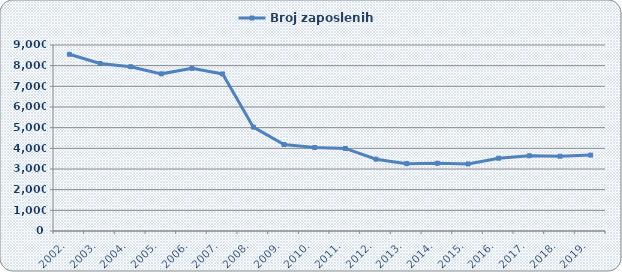
| Category | Broj zaposlenih |
|---|---|
| 2002. | 8552 |
| 2003. | 8105 |
| 2004. | 7949 |
| 2005. | 7604 |
| 2006. | 7874 |
| 2007. | 7599 |
| 2008. | 5026 |
| 2009. | 4183 |
| 2010. | 4039 |
| 2011. | 3995 |
| 2012. | 3475 |
| 2013. | 3260 |
| 2014. | 3276 |
| 2015. | 3245 |
| 2016. | 3523 |
| 2017. | 3640 |
| 2018. | 3618 |
| 2019. | 3672 |